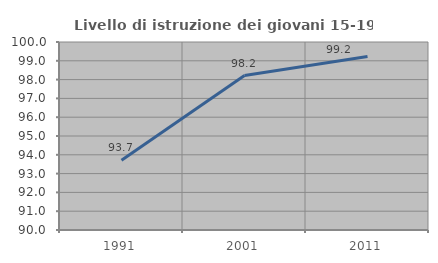
| Category | Livello di istruzione dei giovani 15-19 anni |
|---|---|
| 1991.0 | 93.714 |
| 2001.0 | 98.214 |
| 2011.0 | 99.231 |